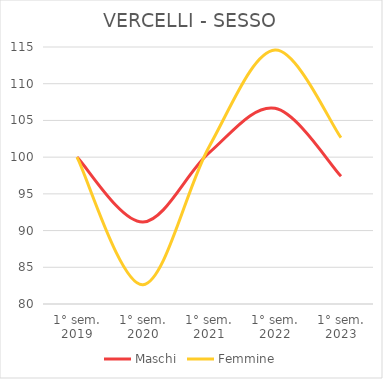
| Category | Maschi | Femmine |
|---|---|---|
| 1° sem.
2019 | 100 | 100 |
| 1° sem.
2020 | 91.156 | 82.623 |
| 1° sem.
2021 | 100.578 | 101.396 |
| 1° sem.
2022 | 106.647 | 114.585 |
| 1° sem.
2023 | 97.399 | 102.645 |